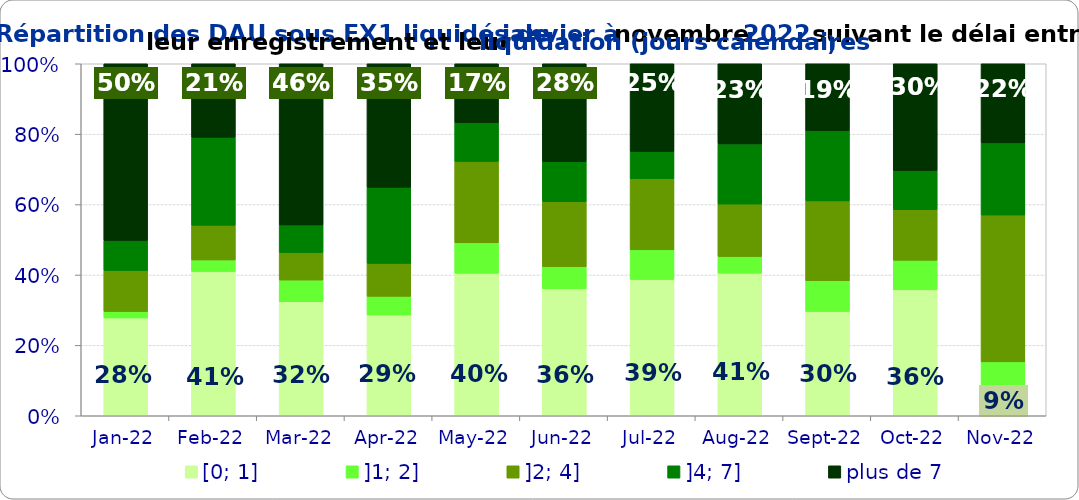
| Category | [0; 1] | ]1; 2] | ]2; 4] | ]4; 7] | plus de 7 |
|---|---|---|---|---|---|
| 2022-01-01 | 0.278 | 0.018 | 0.117 | 0.085 | 0.502 |
| 2022-02-01 | 0.41 | 0.033 | 0.098 | 0.25 | 0.209 |
| 2022-03-01 | 0.324 | 0.061 | 0.078 | 0.078 | 0.458 |
| 2022-04-01 | 0.287 | 0.053 | 0.094 | 0.216 | 0.351 |
| 2022-05-01 | 0.405 | 0.087 | 0.231 | 0.11 | 0.168 |
| 2022-06-01 | 0.361 | 0.063 | 0.184 | 0.114 | 0.278 |
| 2022-07-01 | 0.387 | 0.084 | 0.202 | 0.077 | 0.249 |
| 2022-08-01 | 0.405 | 0.047 | 0.149 | 0.171 | 0.228 |
| 2022-09-01 | 0.296 | 0.088 | 0.227 | 0.199 | 0.19 |
| 2022-10-01 | 0.358 | 0.084 | 0.144 | 0.111 | 0.304 |
| 2022-11-01 | 0.088 | 0.065 | 0.417 | 0.205 | 0.225 |